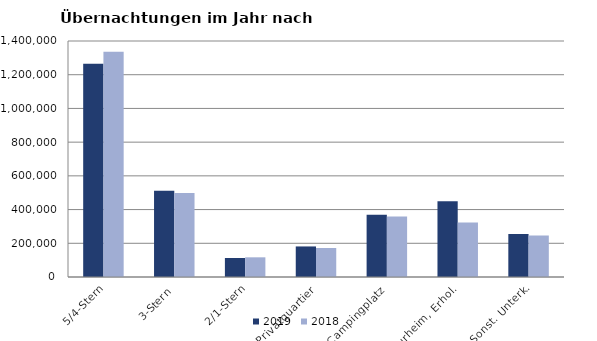
| Category | 2019 | 2018 |
|---|---|---|
| 5/4-Stern | 1264746 | 1335689 |
| 3-Stern | 512318 | 497893 |
| 2/1-Stern | 112611 | 116761 |
| Privatquartier | 181265 | 172058 |
| Campingplatz | 368801 | 358485 |
| Kurheim, Erhol. | 449652 | 323457 |
| Sonst. Unterk. | 254839 | 246221 |